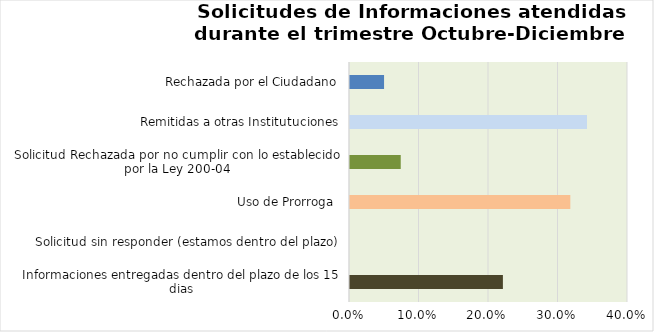
| Category | Series 0 |
|---|---|
| Informaciones entregadas dentro del plazo de los 15 dias | 0.22 |
| Solicitud sin responder (estamos dentro del plazo) | 0 |
| Uso de Prorroga  | 0.317 |
| Solicitud Rechazada por no cumplir con lo establecido por la Ley 200-04 | 0.073 |
| Remitidas a otras Institutuciones | 0.341 |
| Rechazada por el Ciudadano | 0.049 |